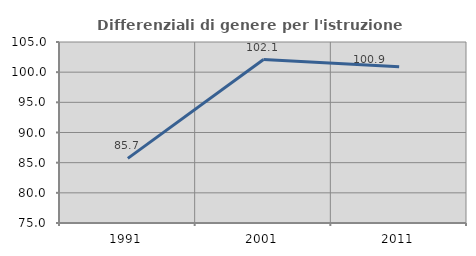
| Category | Differenziali di genere per l'istruzione superiore |
|---|---|
| 1991.0 | 85.714 |
| 2001.0 | 102.094 |
| 2011.0 | 100.899 |